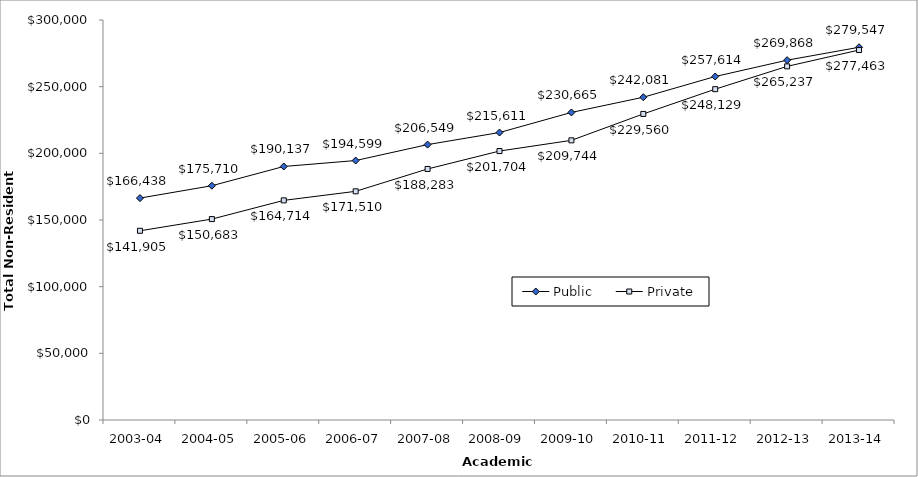
| Category | Public | Private |
|---|---|---|
| 2003-04 | 166438 | 141905 |
| 2004-05 | 175710 | 150683 |
| 2005-06 | 190137 | 164714 |
| 2006-07 | 194599 | 171510 |
| 2007-08 | 206549 | 188283 |
| 2008-09 | 215611 | 201704 |
| 2009-10 | 230665 | 209744 |
| 2010-11 | 242081 | 229560 |
| 2011-12 | 257614 | 248129 |
| 2012-13 | 269868 | 265237 |
| 2013-14 | 279547 | 277463 |